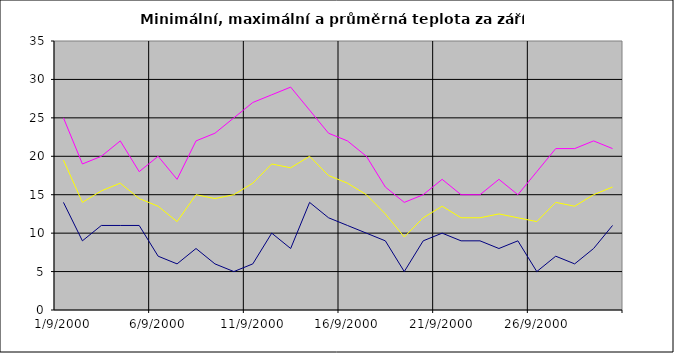
| Category | Series 0 | Series 1 | Series 2 |
|---|---|---|---|
| 2000-09-01 | 14 | 25 | 19.5 |
| 2000-09-02 | 9 | 19 | 14 |
| 2000-09-03 | 11 | 20 | 15.5 |
| 2000-09-04 | 11 | 22 | 16.5 |
| 2000-09-05 | 11 | 18 | 14.5 |
| 2000-09-06 | 7 | 20 | 13.5 |
| 2000-09-07 | 6 | 17 | 11.5 |
| 2000-09-08 | 8 | 22 | 15 |
| 2000-09-09 | 6 | 23 | 14.5 |
| 2000-09-10 | 5 | 25 | 15 |
| 2000-09-11 | 6 | 27 | 16.5 |
| 2000-09-12 | 10 | 28 | 19 |
| 2000-09-13 | 8 | 29 | 18.5 |
| 2000-09-14 | 14 | 26 | 20 |
| 2000-09-15 | 12 | 23 | 17.5 |
| 2000-09-16 | 11 | 22 | 16.5 |
| 2000-09-17 | 10 | 20 | 15 |
| 2000-09-18 | 9 | 16 | 12.5 |
| 2000-09-19 | 5 | 14 | 9.5 |
| 2000-09-20 | 9 | 15 | 12 |
| 2000-09-21 | 10 | 17 | 13.5 |
| 2000-09-22 | 9 | 15 | 12 |
| 2000-09-23 | 9 | 15 | 12 |
| 2000-09-24 | 8 | 17 | 12.5 |
| 2000-09-25 | 9 | 15 | 12 |
| 2000-09-26 | 5 | 18 | 11.5 |
| 2000-09-27 | 7 | 21 | 14 |
| 2000-09-28 | 6 | 21 | 13.5 |
| 2000-09-29 | 8 | 22 | 15 |
| 2000-09-30 | 11 | 21 | 16 |